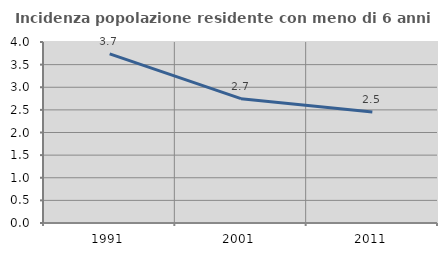
| Category | Incidenza popolazione residente con meno di 6 anni |
|---|---|
| 1991.0 | 3.736 |
| 2001.0 | 2.747 |
| 2011.0 | 2.454 |